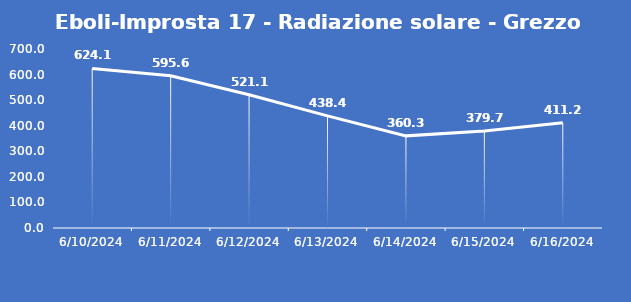
| Category | Eboli-Improsta 17 - Radiazione solare - Grezzo (W/m2) |
|---|---|
| 6/10/24 | 624.1 |
| 6/11/24 | 595.6 |
| 6/12/24 | 521.1 |
| 6/13/24 | 438.4 |
| 6/14/24 | 360.3 |
| 6/15/24 | 379.7 |
| 6/16/24 | 411.2 |